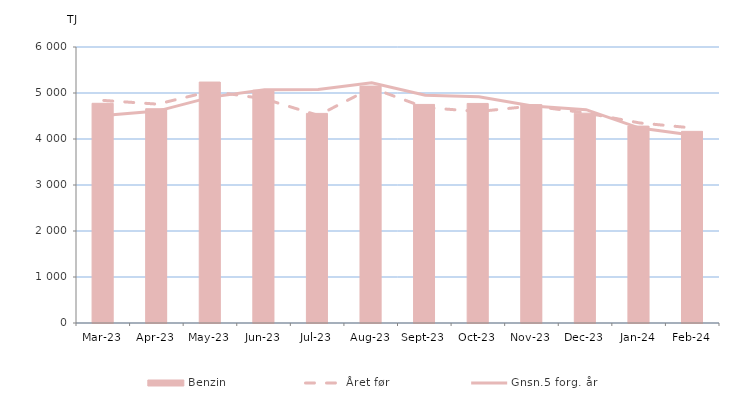
| Category | Benzin |
|---|---|
| 2023-03-01 | 4776.062 |
| 2023-04-01 | 4657.999 |
| 2023-05-01 | 5237.834 |
| 2023-06-01 | 5060.74 |
| 2023-07-01 | 4556.525 |
| 2023-08-01 | 5150.223 |
| 2023-09-01 | 4751.49 |
| 2023-10-01 | 4772.809 |
| 2023-11-01 | 4748.008 |
| 2023-12-01 | 4561.19 |
| 2024-01-01 | 4280.454 |
| 2024-02-01 | 4166.366 |